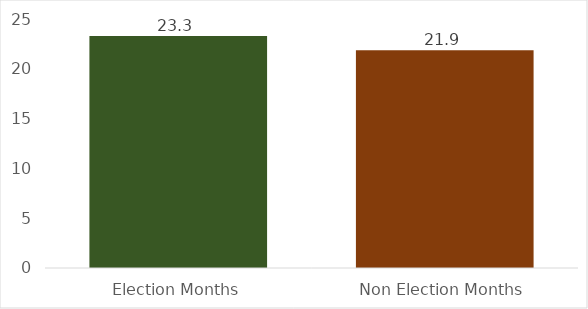
| Category | Average Monthly Payments |
|---|---|
| Election Months | 23.3 |
| Non Election Months | 21.86 |